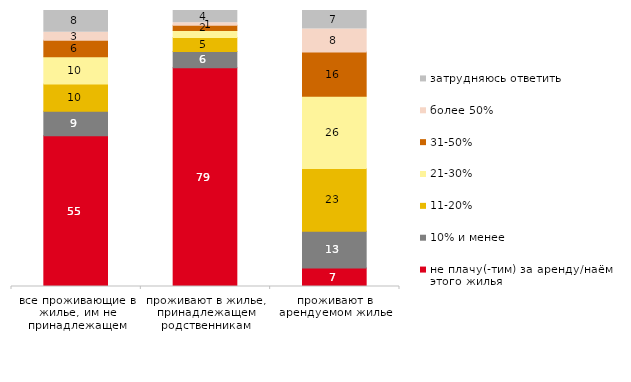
| Category | не плачу(-тим) за аренду/наём этого жилья | 10% и менее | 11-20% | 21-30% | 31-50% | более 50% | затрудняюсь ответить |
|---|---|---|---|---|---|---|---|
| все проживающие в жилье, им не принадлежащем | 54.651 | 8.866 | 9.884 | 9.884 | 5.959 | 2.907 | 7.849 |
| проживают в жилье, принадлежащем родственникам | 79.272 | 5.882 | 5.042 | 2.521 | 1.961 | 0.84 | 4.482 |
| проживают в арендуемом жилье | 6.667 | 13.333 | 22.778 | 26.111 | 16.111 | 8.333 | 6.667 |